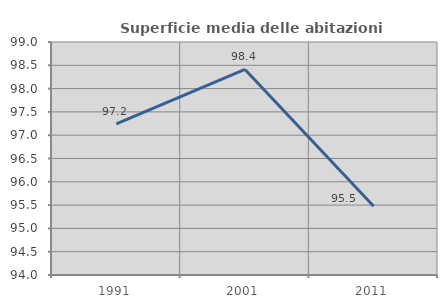
| Category | Superficie media delle abitazioni occupate |
|---|---|
| 1991.0 | 97.244 |
| 2001.0 | 98.411 |
| 2011.0 | 95.476 |